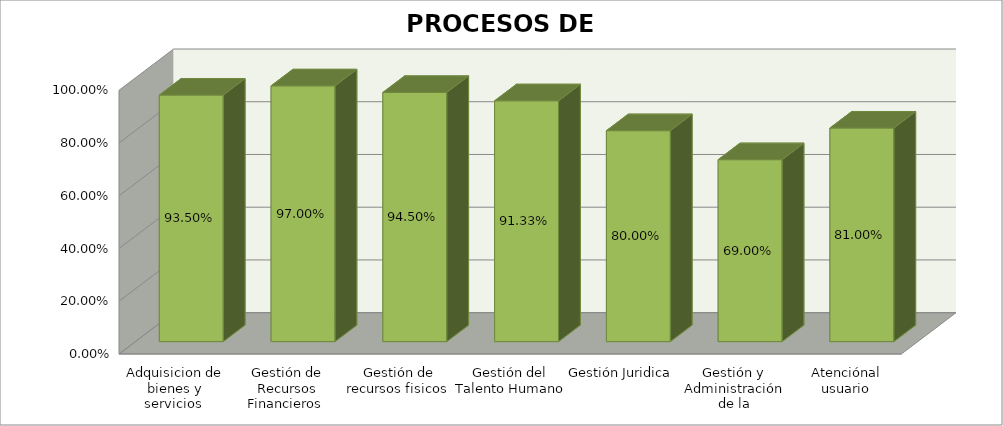
| Category | Series 0 |
|---|---|
| Adquisicion de bienes y servicios  | 0.935 |
| Gestión de Recursos Financieros  | 0.97 |
| Gestión de recursos fisicos  | 0.945 |
| Gestión del Talento Humano | 0.913 |
| Gestión Juridica  | 0.8 |
| Gestión y Administración de la Información  | 0.69 |
| Atenciónal usuario | 0.81 |